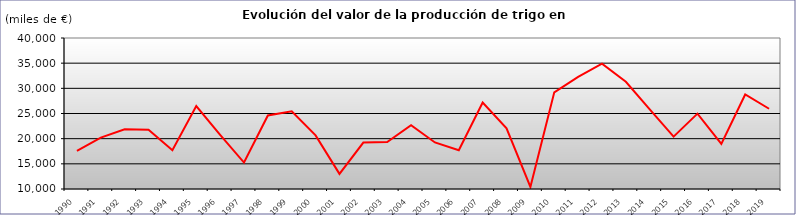
| Category | VALOR 
(miles de €) |
|---|---|
| 1990.0 | 17559.771 |
| 1991.0 | 20200.017 |
| 1992.0 | 21870.229 |
| 1993.0 | 21787.29 |
| 1994.0 | 17701.008 |
| 1995.0 | 26492.013 |
| 1996.0 | 20774.284 |
| 1997.0 | 15250.682 |
| 1998.0 | 24609.643 |
| 1999.0 | 25451.06 |
| 2000.0 | 20653.9 |
| 2001.0 | 13004.4 |
| 2002.0 | 19232.8 |
| 2003.0 | 19348.7 |
| 2004.0 | 22690.1 |
| 2005.0 | 19245.7 |
| 2006.0 | 17709.9 |
| 2007.0 | 27174.6 |
| 2008.0 | 22062.6 |
| 2009.0 | 10409.2 |
| 2010.0 | 29211.1 |
| 2011.0 | 32280.6 |
| 2012.0 | 34887.6 |
| 2013.0 | 31294.1 |
| 2014.0 | 25815.9 |
| 2015.0 | 20408.36 |
| 2016.0 | 24971.07 |
| 2017.0 | 18974.66 |
| 2018.0 | 28774.61 |
| 2019.0 | 25945.81 |